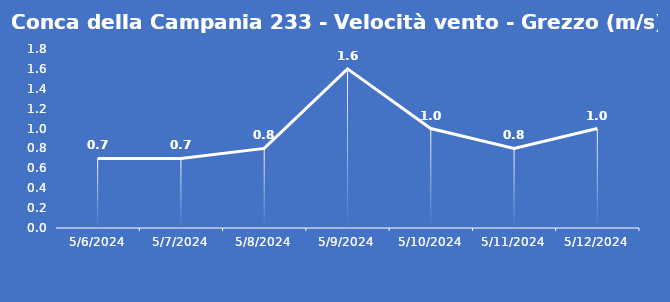
| Category | Conca della Campania 233 - Velocità vento - Grezzo (m/s) |
|---|---|
| 5/6/24 | 0.7 |
| 5/7/24 | 0.7 |
| 5/8/24 | 0.8 |
| 5/9/24 | 1.6 |
| 5/10/24 | 1 |
| 5/11/24 | 0.8 |
| 5/12/24 | 1 |